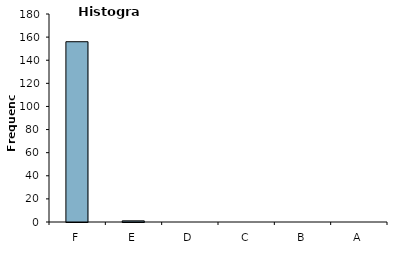
| Category | Grade |
|---|---|
| F | 156 |
| E | 1 |
| D | 0 |
| C | 0 |
| B | 0 |
| A | 0 |